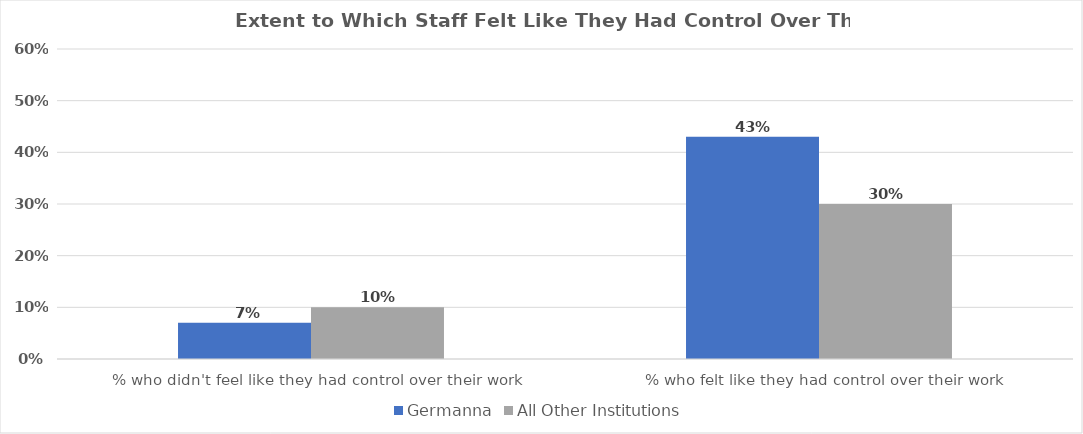
| Category | Germanna | All Other Institutions |
|---|---|---|
| % who didn't feel like they had control over their work
 | 0.07 | 0.1 |
| % who felt like they had control over their work
 | 0.43 | 0.3 |